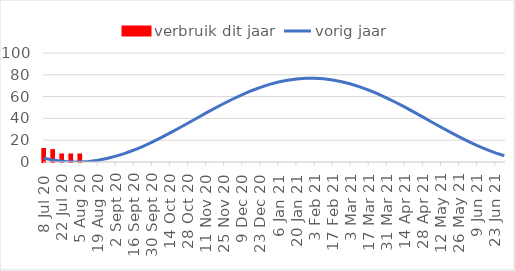
| Category | verbruik dit jaar |
|---|---|
| 2020-07-08 | 11 |
| 2020-07-15 | 10 |
| 2020-07-22 | 6 |
| 2020-07-29 | 6 |
| 2020-08-05 | 6 |
| 2020-08-12 | 0 |
| 2020-08-19 | 0 |
| 2020-08-26 | 0 |
| 2020-09-02 | 0 |
| 2020-09-09 | 0 |
| 2020-09-16 | 0 |
| 2020-09-23 | 0 |
| 2020-09-30 | 0 |
| 2020-10-07 | 0 |
| 2020-10-14 | 0 |
| 2020-10-21 | 0 |
| 2020-10-28 | 0 |
| 2020-11-04 | 0 |
| 2020-11-11 | 0 |
| 2020-11-18 | 0 |
| 2020-11-25 | 0 |
| 2020-12-02 | 0 |
| 2020-12-09 | 0 |
| 2020-12-16 | 0 |
| 2020-12-23 | 0 |
| 2020-12-30 | 0 |
| 2021-01-06 | 0 |
| 2021-01-13 | 0 |
| 2021-01-20 | 0 |
| 2021-01-27 | 0 |
| 2021-02-03 | 0 |
| 2021-02-10 | 0 |
| 2021-02-17 | 0 |
| 2021-02-24 | 0 |
| 2021-03-03 | 0 |
| 2021-03-10 | 0 |
| 2021-03-17 | 0 |
| 2021-03-24 | 0 |
| 2021-03-31 | 0 |
| 2021-04-07 | 0 |
| 2021-04-14 | 0 |
| 2021-04-21 | 0 |
| 2021-04-28 | 0 |
| 2021-05-05 | 0 |
| 2021-05-12 | 0 |
| 2021-05-19 | 0 |
| 2021-05-26 | 0 |
| 2021-06-02 | 0 |
| 2021-06-09 | 0 |
| 2021-06-16 | 0 |
| 2021-06-23 | 0 |
| 2021-06-30 | 0 |